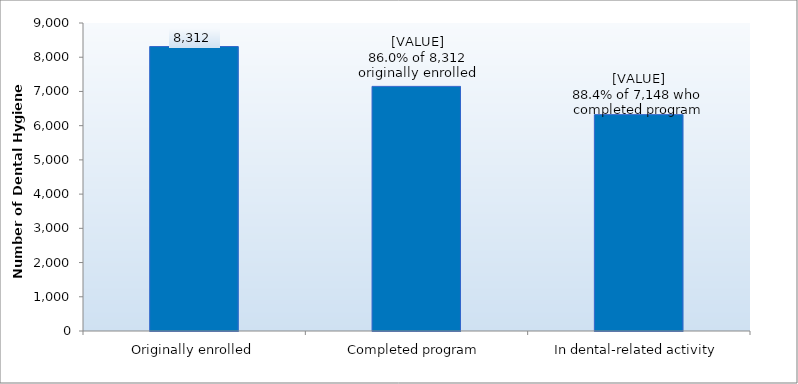
| Category | Series 0 |
|---|---|
| Originally enrolled | 8312 |
| Completed program | 7148 |
| In dental-related activity | 6322 |